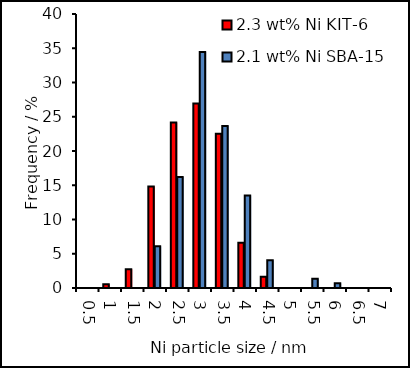
| Category | 2.3 wt% Ni KIT-6 | 2.1 wt% Ni SBA-15 |
|---|---|---|
| 0.5 | 0 | 0 |
| 1.0 | 0.549 | 0 |
| 1.5 | 2.747 | 0 |
| 2.0 | 14.835 | 6.081 |
| 2.5 | 24.176 | 16.216 |
| 3.0 | 26.923 | 34.459 |
| 3.5 | 22.527 | 23.649 |
| 4.0 | 6.593 | 13.514 |
| 4.5 | 1.648 | 4.054 |
| 5.0 | 0 | 0 |
| 5.5 | 0 | 1.351 |
| 6.0 | 0 | 0.676 |
| 6.5 | 0 | 0 |
| 7.0 | 0 | 0 |